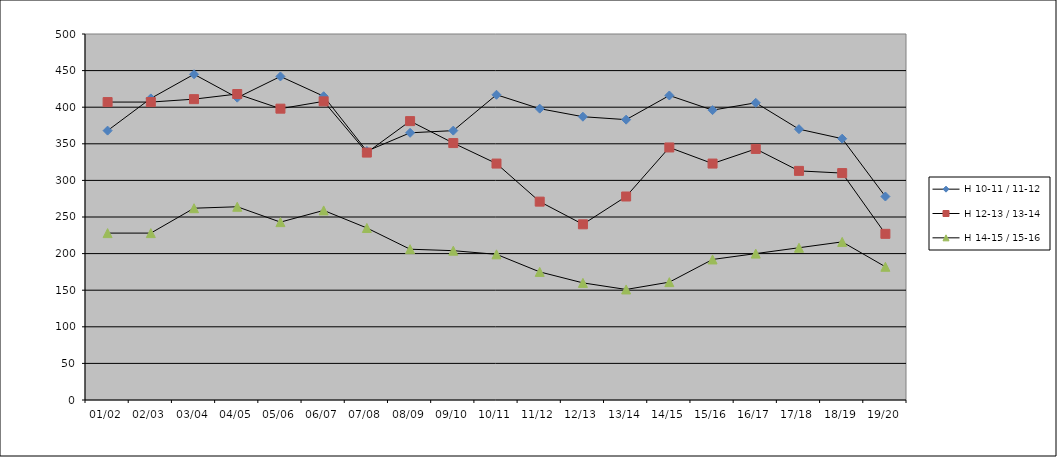
| Category | H 10-11 / 11-12 | H 12-13 / 13-14 | H 14-15 / 15-16 |
|---|---|---|---|
| 01/02 | 368 | 407 | 228 |
| 02/03 | 412 | 407 | 228 |
| 03/04 | 445 | 411 | 262 |
| 04/05 | 413 | 418 | 264 |
| 05/06 | 442 | 398 | 243 |
| 06/07 | 415 | 408 | 259 |
| 07/08 | 340 | 338 | 235 |
| 08/09 | 365 | 381 | 206 |
| 09/10 | 368 | 351 | 204 |
| 10/11 | 417 | 323 | 199 |
| 11/12 | 398 | 271 | 175 |
| 12/13 | 387 | 240 | 160 |
| 13/14 | 383 | 278 | 151 |
| 14/15 | 416 | 345 | 161 |
| 15/16 | 396 | 323 | 192 |
| 16/17 | 406 | 343 | 200 |
| 17/18 | 370 | 313 | 208 |
| 18/19 | 357 | 310 | 216 |
| 19/20 | 278 | 227 | 182 |